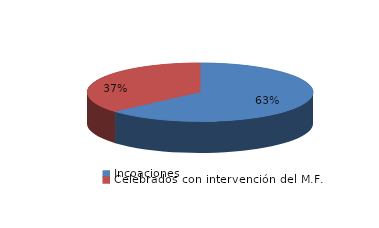
| Category | Series 0 |
|---|---|
| Incoaciones | 6795 |
| Celebrados con intervención del M.F. | 3911 |